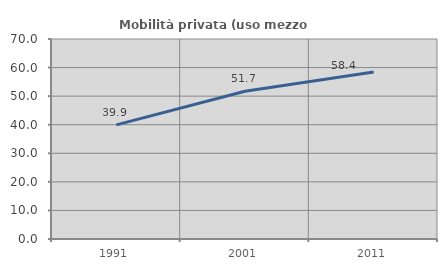
| Category | Mobilità privata (uso mezzo privato) |
|---|---|
| 1991.0 | 39.947 |
| 2001.0 | 51.701 |
| 2011.0 | 58.435 |